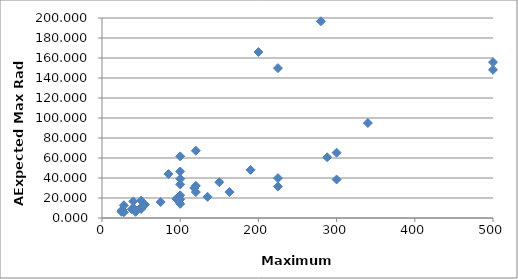
| Category | Series 0 |
|---|---|
| 25.0 | 6.209 |
| 340.0 | 94.984 |
| 28.0 | 5.751 |
| 1300.0 | 294.32 |
| 150.0 | 35.78 |
| 163.0 | 25.925 |
| 50.0 | 9.019 |
| 100.0 | 18.645 |
| 50.0 | 10.208 |
| 300.0 | 65.32 |
| 600.0 | 763.995 |
| 1800.0 | 964.94 |
| 280.0 | 196.721 |
| 200.0 | 165.968 |
| 100.0 | 61.653 |
| 120.0 | 67.275 |
| 40.0 | 16.654 |
| 100.0 | 33.574 |
| 100.0 | 39.134 |
| 100.0 | 46.547 |
| 28.0 | 12.732 |
| 85.0 | 43.938 |
| 26.0 | 8.123 |
| 100.0 | 22.679 |
| 500.0 | 155.837 |
| 500.0 | 148.209 |
| 55.0 | 13.356 |
| 118.0 | 29.976 |
| 40.0 | 9.774 |
| 190.0 | 48.121 |
| 50.0 | 17.348 |
| 120.0 | 25.915 |
| 25.0 | 7.167 |
| 120.0 | 32.157 |
| 42.0 | 8.538 |
| 288.0 | 60.724 |
| 95.0 | 19.118 |
| 300.0 | 38.525 |
| 75.0 | 15.981 |
| 100.0 | 14.163 |
| 50.0 | 10.436 |
| 225.0 | 39.918 |
| 43.0 | 6.174 |
| 225.0 | 31.536 |
| 50.0 | 9.833 |
| 135.0 | 21.179 |
| 38.0 | 8.744 |
| 225.0 | 149.881 |